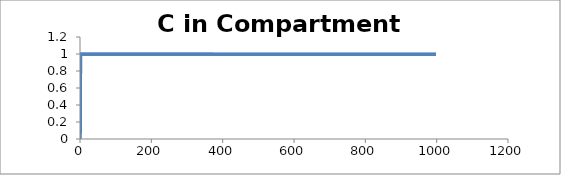
| Category | C - Sys 1 |
|---|---|
| 1.0 | 0 |
| 2.0 | 1 |
| 3.0 | 1 |
| 4.0 | 1 |
| 5.0 | 1 |
| 6.0 | 1 |
| 7.0 | 1 |
| 8.0 | 1 |
| 9.000000000000002 | 1 |
| 10.0 | 1 |
| 11.0 | 1 |
| 12.0 | 1 |
| 13.000000000000002 | 1 |
| 14.0 | 1 |
| 15.0 | 1 |
| 16.0 | 1 |
| 17.0 | 1 |
| 18.000000000000004 | 1 |
| 19.0 | 1 |
| 20.0 | 1 |
| 21.0 | 1 |
| 22.0 | 1 |
| 23.0 | 1 |
| 24.0 | 1 |
| 25.0 | 1 |
| 26.000000000000004 | 1 |
| 27.0 | 1 |
| 28.0 | 1 |
| 29.0 | 1 |
| 30.0 | 1 |
| 31.0 | 1 |
| 32.0 | 1 |
| 33.0 | 1 |
| 34.0 | 1 |
| 35.0 | 1 |
| 36.00000000000001 | 1 |
| 37.0 | 1 |
| 38.0 | 1 |
| 39.0 | 1 |
| 40.0 | 1 |
| 41.0 | 1 |
| 42.0 | 1 |
| 43.0 | 1 |
| 44.0 | 1 |
| 45.0 | 1 |
| 46.0 | 1 |
| 47.0 | 1 |
| 48.0 | 1 |
| 49.0 | 1 |
| 50.0 | 1 |
| 51.00000000000001 | 1 |
| 52.00000000000001 | 1 |
| 53.0 | 1 |
| 54.0 | 1 |
| 55.0 | 1 |
| 56.0 | 1 |
| 57.0 | 1 |
| 58.0 | 1 |
| 59.00000000000001 | 1 |
| 60.0 | 1 |
| 61.0 | 1 |
| 62.0 | 1 |
| 63.0 | 1 |
| 64.0 | 1 |
| 65.0 | 1 |
| 66.0 | 1 |
| 67.0 | 1 |
| 68.0 | 1 |
| 69.0 | 1 |
| 70.0 | 1 |
| 71.00000000000001 | 1 |
| 72.00000000000001 | 1 |
| 73.0 | 1 |
| 74.0 | 1 |
| 75.0 | 1 |
| 76.0 | 1 |
| 77.0 | 1 |
| 78.0 | 1 |
| 79.0 | 1 |
| 80.0 | 1 |
| 81.0 | 1 |
| 82.0 | 1 |
| 83.0 | 1 |
| 84.0 | 1 |
| 85.0 | 1 |
| 86.0 | 1 |
| 87.00000000000001 | 1 |
| 88.0 | 1 |
| 89.0 | 1 |
| 90.0 | 1 |
| 91.0 | 1 |
| 92.0 | 1 |
| 93.0 | 1 |
| 94.0 | 1 |
| 95.0 | 1 |
| 96.0 | 1 |
| 97.0 | 1 |
| 98.0 | 1 |
| 99.0 | 1 |
| 100.0 | 1 |
| 101.0 | 1 |
| 102.00000000000001 | 1 |
| 103.00000000000001 | 1 |
| 104.00000000000001 | 1 |
| 105.0 | 1 |
| 106.0 | 1 |
| 107.0 | 1 |
| 108.0 | 1 |
| 109.0 | 1 |
| 110.0 | 1 |
| 111.0 | 1 |
| 112.0 | 1 |
| 113.0 | 1 |
| 114.0 | 1 |
| 115.0 | 1 |
| 116.0 | 1 |
| 117.0 | 1 |
| 118.00000000000001 | 1 |
| 119.00000000000001 | 1 |
| 120.0 | 1 |
| 121.0 | 1 |
| 122.0 | 1 |
| 123.0 | 1 |
| 124.0 | 1 |
| 125.0 | 1 |
| 126.0 | 1 |
| 127.0 | 0.999 |
| 128.0 | 0.999 |
| 129.0 | 0.999 |
| 130.0 | 0.999 |
| 131.0 | 0.999 |
| 132.0 | 0.999 |
| 133.0 | 0.999 |
| 134.0 | 0.999 |
| 135.0 | 0.999 |
| 136.0 | 0.999 |
| 137.0 | 0.999 |
| 138.0 | 0.999 |
| 139.0 | 0.999 |
| 140.0 | 0.999 |
| 141.0 | 0.999 |
| 142.00000000000003 | 0.999 |
| 143.00000000000003 | 0.999 |
| 144.00000000000003 | 0.999 |
| 145.0 | 0.999 |
| 146.0 | 0.999 |
| 147.0 | 0.999 |
| 148.0 | 0.999 |
| 149.0 | 0.999 |
| 150.0 | 0.999 |
| 151.0 | 0.999 |
| 152.0 | 0.999 |
| 153.0 | 0.999 |
| 154.0 | 0.999 |
| 155.0 | 0.999 |
| 156.0 | 0.999 |
| 157.0 | 0.999 |
| 158.0 | 0.999 |
| 159.0 | 0.999 |
| 160.0 | 0.999 |
| 161.0 | 0.999 |
| 162.0 | 0.999 |
| 163.0 | 0.999 |
| 164.0 | 0.999 |
| 165.0 | 0.999 |
| 166.0 | 0.999 |
| 167.0 | 0.999 |
| 168.0 | 0.999 |
| 169.0 | 0.999 |
| 170.0 | 0.999 |
| 171.0 | 0.999 |
| 172.0 | 0.999 |
| 173.00000000000003 | 0.999 |
| 174.00000000000003 | 0.999 |
| 175.00000000000003 | 0.999 |
| 176.0 | 0.999 |
| 177.0 | 0.999 |
| 178.0 | 0.999 |
| 179.0 | 0.999 |
| 180.0 | 0.999 |
| 181.0 | 0.999 |
| 182.0 | 0.999 |
| 183.0 | 0.999 |
| 184.0 | 0.999 |
| 185.0 | 0.999 |
| 186.0 | 0.999 |
| 187.0 | 0.999 |
| 188.0 | 0.999 |
| 189.0 | 0.999 |
| 190.0 | 0.999 |
| 191.0 | 0.999 |
| 192.0 | 0.999 |
| 193.0 | 0.999 |
| 194.0 | 0.999 |
| 195.0 | 0.999 |
| 196.0 | 0.999 |
| 197.0 | 0.999 |
| 198.0 | 0.999 |
| 199.0 | 0.999 |
| 200.0 | 0.999 |
| 201.0 | 0.999 |
| 202.0 | 0.999 |
| 203.0 | 0.999 |
| 204.00000000000003 | 0.999 |
| 205.00000000000003 | 0.999 |
| 206.00000000000003 | 0.999 |
| 207.00000000000003 | 0.999 |
| 208.00000000000003 | 0.999 |
| 209.0 | 0.999 |
| 210.0 | 0.999 |
| 211.0 | 0.999 |
| 212.0 | 0.999 |
| 213.0 | 0.999 |
| 214.0 | 0.999 |
| 215.0 | 0.999 |
| 216.0 | 0.999 |
| 217.0 | 0.999 |
| 218.0 | 0.999 |
| 219.0 | 0.999 |
| 220.0 | 0.999 |
| 221.0 | 0.999 |
| 222.0 | 0.999 |
| 223.0 | 0.999 |
| 224.0 | 0.999 |
| 225.0 | 0.999 |
| 226.0 | 0.999 |
| 227.0 | 0.999 |
| 228.0 | 0.999 |
| 229.0 | 0.999 |
| 230.0 | 0.999 |
| 231.0 | 0.999 |
| 232.0 | 0.999 |
| 233.0 | 0.999 |
| 234.0 | 0.999 |
| 235.00000000000003 | 0.999 |
| 236.00000000000003 | 0.999 |
| 237.00000000000003 | 0.999 |
| 238.00000000000003 | 0.999 |
| 239.00000000000003 | 0.999 |
| 240.0 | 0.999 |
| 241.0 | 0.999 |
| 242.0 | 0.999 |
| 243.0 | 0.999 |
| 244.0 | 0.999 |
| 245.0 | 0.999 |
| 246.0 | 0.999 |
| 247.0 | 0.999 |
| 248.0 | 0.999 |
| 249.0 | 0.999 |
| 250.0 | 0.999 |
| 251.0 | 0.999 |
| 252.0 | 0.999 |
| 253.0 | 0.999 |
| 254.0 | 0.999 |
| 255.0 | 0.999 |
| 256.0 | 0.999 |
| 257.0 | 0.999 |
| 258.0 | 0.999 |
| 259.0 | 0.999 |
| 260.0 | 0.999 |
| 261.0 | 0.999 |
| 262.0 | 0.999 |
| 263.0 | 0.999 |
| 264.0 | 0.999 |
| 265.0 | 0.999 |
| 266.0 | 0.999 |
| 267.0 | 0.999 |
| 268.0 | 0.999 |
| 269.0 | 0.999 |
| 270.0 | 0.999 |
| 271.0 | 0.999 |
| 272.0 | 0.999 |
| 273.0 | 0.999 |
| 274.0 | 0.999 |
| 275.0 | 0.999 |
| 276.0 | 0.999 |
| 277.0 | 0.999 |
| 278.0 | 0.999 |
| 279.0 | 0.999 |
| 280.0 | 0.999 |
| 281.0 | 0.999 |
| 282.0 | 0.999 |
| 283.00000000000006 | 0.999 |
| 284.00000000000006 | 0.999 |
| 285.00000000000006 | 0.999 |
| 286.00000000000006 | 0.999 |
| 287.00000000000006 | 0.999 |
| 288.00000000000006 | 0.999 |
| 289.0 | 0.999 |
| 290.0 | 0.999 |
| 291.0 | 0.999 |
| 292.0 | 0.999 |
| 293.0 | 0.999 |
| 294.0 | 0.999 |
| 295.0 | 0.999 |
| 296.0 | 0.999 |
| 297.0 | 0.999 |
| 298.0 | 0.999 |
| 299.0 | 0.999 |
| 300.0 | 0.999 |
| 301.0 | 0.999 |
| 302.0 | 0.999 |
| 303.0 | 0.999 |
| 304.0 | 0.999 |
| 305.0 | 0.999 |
| 306.0 | 0.999 |
| 307.0 | 0.999 |
| 308.0 | 0.999 |
| 309.0 | 0.999 |
| 310.0 | 0.999 |
| 311.0 | 0.999 |
| 312.0 | 0.999 |
| 313.0 | 0.999 |
| 314.0 | 0.999 |
| 315.0 | 0.999 |
| 316.0 | 0.999 |
| 317.0 | 0.999 |
| 318.0 | 0.999 |
| 319.0 | 0.999 |
| 320.0 | 0.999 |
| 321.0 | 0.999 |
| 322.0 | 0.999 |
| 323.0 | 0.999 |
| 324.0 | 0.999 |
| 325.0 | 0.999 |
| 326.0 | 0.999 |
| 327.0 | 0.999 |
| 328.0 | 0.999 |
| 329.0 | 0.999 |
| 330.0 | 0.999 |
| 331.0 | 0.999 |
| 332.0 | 0.999 |
| 333.0 | 0.999 |
| 334.0 | 0.999 |
| 335.0 | 0.999 |
| 336.0 | 0.999 |
| 337.0 | 0.999 |
| 338.0 | 0.999 |
| 339.0 | 0.999 |
| 340.0 | 0.999 |
| 341.0 | 0.999 |
| 342.0 | 0.999 |
| 343.0 | 0.999 |
| 344.0 | 0.999 |
| 345.00000000000006 | 0.999 |
| 346.00000000000006 | 0.999 |
| 347.00000000000006 | 0.999 |
| 348.00000000000006 | 0.999 |
| 349.00000000000006 | 0.999 |
| 350.00000000000006 | 0.999 |
| 351.00000000000006 | 0.999 |
| 352.0 | 0.999 |
| 353.0 | 0.999 |
| 354.0 | 0.999 |
| 355.0 | 0.999 |
| 356.0 | 0.999 |
| 357.0 | 0.999 |
| 358.0 | 0.999 |
| 359.0 | 0.999 |
| 360.0 | 0.999 |
| 361.0 | 0.999 |
| 362.0 | 0.999 |
| 363.0 | 0.999 |
| 364.0 | 0.999 |
| 365.0 | 0.999 |
| 366.0 | 0.999 |
| 367.0 | 0.999 |
| 368.0 | 0.999 |
| 369.0 | 0.999 |
| 370.0 | 0.999 |
| 371.0 | 0.999 |
| 372.0 | 0.999 |
| 373.0 | 0.999 |
| 374.0 | 0.999 |
| 375.0 | 0.999 |
| 376.0 | 0.999 |
| 377.0 | 0.999 |
| 378.0 | 0.999 |
| 379.0 | 0.999 |
| 380.0 | 0.998 |
| 381.0 | 0.998 |
| 382.0 | 0.998 |
| 383.0 | 0.998 |
| 384.0 | 0.998 |
| 385.0 | 0.998 |
| 386.0 | 0.998 |
| 387.0 | 0.998 |
| 388.0 | 0.998 |
| 389.0 | 0.998 |
| 390.0 | 0.998 |
| 391.0 | 0.998 |
| 392.0 | 0.998 |
| 393.0 | 0.998 |
| 394.0 | 0.998 |
| 395.0 | 0.998 |
| 396.0 | 0.998 |
| 397.0 | 0.998 |
| 398.0 | 0.998 |
| 399.0 | 0.998 |
| 400.0 | 0.998 |
| 401.0 | 0.998 |
| 402.0 | 0.998 |
| 403.0 | 0.998 |
| 404.0 | 0.998 |
| 405.0 | 0.998 |
| 406.0 | 0.998 |
| 407.0 | 0.998 |
| 408.00000000000006 | 0.998 |
| 409.00000000000006 | 0.998 |
| 410.00000000000006 | 0.998 |
| 411.00000000000006 | 0.998 |
| 412.00000000000006 | 0.998 |
| 413.00000000000006 | 0.998 |
| 414.00000000000006 | 0.998 |
| 415.00000000000006 | 0.998 |
| 416.00000000000006 | 0.998 |
| 417.0 | 0.998 |
| 418.0 | 0.998 |
| 419.0 | 0.998 |
| 420.0 | 0.998 |
| 421.0 | 0.998 |
| 422.0 | 0.998 |
| 423.0 | 0.998 |
| 424.0 | 0.998 |
| 425.0 | 0.998 |
| 426.0 | 0.998 |
| 427.0 | 0.998 |
| 428.0 | 0.998 |
| 429.0 | 0.998 |
| 430.0 | 0.998 |
| 431.0 | 0.998 |
| 432.0 | 0.998 |
| 433.0 | 0.998 |
| 434.0 | 0.998 |
| 435.0 | 0.998 |
| 436.0 | 0.998 |
| 437.0 | 0.998 |
| 438.0 | 0.998 |
| 439.0 | 0.998 |
| 440.0 | 0.998 |
| 441.0 | 0.998 |
| 442.0 | 0.998 |
| 443.0 | 0.998 |
| 444.0 | 0.998 |
| 445.0 | 0.998 |
| 446.0 | 0.998 |
| 447.0 | 0.998 |
| 448.0 | 0.998 |
| 449.0 | 0.998 |
| 450.0 | 0.998 |
| 451.0 | 0.998 |
| 452.0 | 0.998 |
| 453.0 | 0.998 |
| 454.0 | 0.998 |
| 455.0 | 0.998 |
| 456.0 | 0.998 |
| 457.0 | 0.998 |
| 458.0 | 0.998 |
| 459.0 | 0.998 |
| 460.0 | 0.998 |
| 461.0 | 0.998 |
| 462.0 | 0.998 |
| 463.0 | 0.998 |
| 464.0 | 0.998 |
| 465.0 | 0.998 |
| 466.0 | 0.998 |
| 467.0 | 0.998 |
| 468.0 | 0.998 |
| 469.0 | 0.998 |
| 470.00000000000006 | 0.998 |
| 471.00000000000006 | 0.998 |
| 472.00000000000006 | 0.998 |
| 473.00000000000006 | 0.998 |
| 474.00000000000006 | 0.998 |
| 475.00000000000006 | 0.998 |
| 476.00000000000006 | 0.998 |
| 477.00000000000006 | 0.998 |
| 478.00000000000006 | 0.998 |
| 479.00000000000006 | 0.998 |
| 480.0 | 0.998 |
| 481.0 | 0.998 |
| 482.0 | 0.998 |
| 483.0 | 0.998 |
| 484.0 | 0.998 |
| 485.0 | 0.998 |
| 486.0 | 0.998 |
| 487.0 | 0.998 |
| 488.0 | 0.998 |
| 489.0 | 0.998 |
| 490.0 | 0.998 |
| 491.0 | 0.998 |
| 492.0 | 0.998 |
| 493.0 | 0.998 |
| 494.0 | 0.998 |
| 495.0 | 0.998 |
| 496.0 | 0.998 |
| 497.0 | 0.998 |
| 498.0 | 0.998 |
| 499.0 | 0.998 |
| 500.0 | 0.998 |
| 501.0 | 0.998 |
| 502.0 | 0.998 |
| 503.0 | 0.998 |
| 504.0 | 0.998 |
| 505.0 | 0.998 |
| 506.0 | 0.998 |
| 507.0 | 0.998 |
| 508.0 | 0.998 |
| 509.0 | 0.998 |
| 510.0 | 0.998 |
| 511.0 | 0.998 |
| 512.0 | 0.998 |
| 513.0 | 0.998 |
| 514.0 | 0.998 |
| 515.0 | 0.998 |
| 516.0 | 0.998 |
| 517.0 | 0.998 |
| 518.0 | 0.998 |
| 519.0 | 0.998 |
| 520.0 | 0.998 |
| 521.0 | 0.998 |
| 522.0 | 0.998 |
| 523.0 | 0.998 |
| 524.0 | 0.998 |
| 525.0 | 0.998 |
| 526.0 | 0.998 |
| 527.0 | 0.998 |
| 528.0 | 0.998 |
| 529.0 | 0.998 |
| 530.0 | 0.998 |
| 531.0 | 0.998 |
| 532.0 | 0.998 |
| 533.0 | 0.998 |
| 534.0 | 0.998 |
| 535.0 | 0.998 |
| 536.0 | 0.998 |
| 537.0 | 0.998 |
| 538.0 | 0.998 |
| 539.0 | 0.998 |
| 540.0 | 0.998 |
| 541.0 | 0.998 |
| 542.0 | 0.998 |
| 543.0 | 0.998 |
| 544.0 | 0.998 |
| 545.0 | 0.998 |
| 546.0 | 0.998 |
| 547.0 | 0.998 |
| 548.0 | 0.998 |
| 549.0 | 0.998 |
| 550.0 | 0.998 |
| 551.0 | 0.998 |
| 552.0 | 0.998 |
| 553.0 | 0.998 |
| 554.0 | 0.998 |
| 555.0 | 0.998 |
| 556.0 | 0.998 |
| 557.0 | 0.998 |
| 558.0 | 0.998 |
| 559.0 | 0.998 |
| 560.0 | 0.998 |
| 561.0 | 0.998 |
| 562.0 | 0.998 |
| 563.0 | 0.998 |
| 564.0 | 0.998 |
| 565.0000000000001 | 0.998 |
| 566.0000000000001 | 0.998 |
| 567.0000000000001 | 0.998 |
| 568.0000000000001 | 0.998 |
| 569.0000000000001 | 0.998 |
| 570.0000000000001 | 0.998 |
| 571.0000000000001 | 0.998 |
| 572.0000000000001 | 0.998 |
| 573.0000000000001 | 0.998 |
| 574.0000000000001 | 0.998 |
| 575.0000000000001 | 0.998 |
| 576.0000000000001 | 0.998 |
| 577.0 | 0.998 |
| 578.0 | 0.998 |
| 579.0 | 0.998 |
| 580.0 | 0.998 |
| 581.0 | 0.998 |
| 582.0 | 0.998 |
| 583.0 | 0.998 |
| 584.0 | 0.998 |
| 585.0 | 0.998 |
| 586.0 | 0.998 |
| 587.0 | 0.998 |
| 588.0 | 0.998 |
| 589.0 | 0.998 |
| 590.0 | 0.998 |
| 591.0 | 0.998 |
| 592.0 | 0.998 |
| 593.0 | 0.998 |
| 594.0 | 0.998 |
| 595.0 | 0.998 |
| 596.0 | 0.998 |
| 597.0 | 0.998 |
| 598.0 | 0.998 |
| 599.0 | 0.998 |
| 600.0 | 0.998 |
| 601.0 | 0.998 |
| 602.0 | 0.998 |
| 603.0 | 0.998 |
| 604.0 | 0.998 |
| 605.0 | 0.998 |
| 606.0 | 0.998 |
| 607.0 | 0.998 |
| 608.0 | 0.998 |
| 609.0 | 0.998 |
| 610.0 | 0.998 |
| 611.0 | 0.998 |
| 612.0 | 0.998 |
| 613.0 | 0.998 |
| 614.0 | 0.998 |
| 615.0 | 0.998 |
| 616.0 | 0.998 |
| 617.0 | 0.998 |
| 618.0 | 0.998 |
| 619.0 | 0.998 |
| 620.0 | 0.998 |
| 621.0 | 0.998 |
| 622.0 | 0.998 |
| 623.0 | 0.998 |
| 624.0 | 0.998 |
| 625.0 | 0.998 |
| 626.0 | 0.998 |
| 627.0 | 0.998 |
| 628.0 | 0.998 |
| 629.0 | 0.998 |
| 630.0 | 0.998 |
| 631.0 | 0.998 |
| 632.0 | 0.998 |
| 633.0 | 0.998 |
| 634.0 | 0.998 |
| 635.0 | 0.997 |
| 636.0 | 0.997 |
| 637.0 | 0.997 |
| 638.0 | 0.997 |
| 639.0 | 0.997 |
| 640.0 | 0.997 |
| 641.0 | 0.997 |
| 642.0 | 0.997 |
| 643.0 | 0.997 |
| 644.0 | 0.997 |
| 645.0 | 0.997 |
| 646.0 | 0.997 |
| 647.0 | 0.997 |
| 648.0 | 0.997 |
| 649.0 | 0.997 |
| 650.0 | 0.997 |
| 651.0 | 0.997 |
| 652.0 | 0.997 |
| 653.0 | 0.997 |
| 654.0 | 0.997 |
| 655.0 | 0.997 |
| 656.0 | 0.997 |
| 657.0 | 0.997 |
| 658.0 | 0.997 |
| 659.0 | 0.997 |
| 660.0 | 0.997 |
| 661.0 | 0.997 |
| 662.0 | 0.997 |
| 663.0 | 0.997 |
| 664.0 | 0.997 |
| 665.0 | 0.997 |
| 666.0 | 0.997 |
| 667.0 | 0.997 |
| 668.0 | 0.997 |
| 669.0 | 0.997 |
| 670.0 | 0.997 |
| 671.0 | 0.997 |
| 672.0 | 0.997 |
| 673.0 | 0.997 |
| 674.0 | 0.997 |
| 675.0 | 0.997 |
| 676.0 | 0.997 |
| 677.0 | 0.997 |
| 678.0 | 0.997 |
| 679.0 | 0.997 |
| 680.0 | 0.997 |
| 681.0 | 0.997 |
| 682.0 | 0.997 |
| 683.0 | 0.997 |
| 684.0 | 0.997 |
| 685.0 | 0.997 |
| 686.0 | 0.997 |
| 687.0 | 0.997 |
| 688.0 | 0.997 |
| 689.0 | 0.997 |
| 690.0000000000001 | 0.997 |
| 691.0000000000001 | 0.997 |
| 692.0000000000001 | 0.997 |
| 693.0000000000001 | 0.997 |
| 694.0000000000001 | 0.997 |
| 695.0000000000001 | 0.997 |
| 696.0000000000001 | 0.997 |
| 697.0000000000001 | 0.997 |
| 698.0000000000001 | 0.997 |
| 699.0000000000001 | 0.997 |
| 700.0000000000001 | 0.997 |
| 701.0000000000001 | 0.997 |
| 702.0000000000001 | 0.997 |
| 703.0000000000001 | 0.997 |
| 704.0 | 0.997 |
| 705.0 | 0.997 |
| 706.0 | 0.997 |
| 707.0 | 0.997 |
| 708.0 | 0.997 |
| 709.0 | 0.997 |
| 710.0 | 0.997 |
| 711.0 | 0.997 |
| 712.0 | 0.997 |
| 713.0 | 0.997 |
| 714.0 | 0.997 |
| 715.0 | 0.997 |
| 716.0 | 0.997 |
| 717.0 | 0.997 |
| 718.0 | 0.997 |
| 719.0 | 0.997 |
| 720.0 | 0.997 |
| 721.0 | 0.997 |
| 722.0 | 0.997 |
| 723.0 | 0.997 |
| 724.0 | 0.997 |
| 725.0 | 0.997 |
| 726.0 | 0.997 |
| 727.0 | 0.997 |
| 728.0 | 0.997 |
| 729.0 | 0.997 |
| 730.0 | 0.997 |
| 731.0 | 0.997 |
| 732.0 | 0.997 |
| 733.0 | 0.997 |
| 734.0 | 0.997 |
| 735.0 | 0.997 |
| 736.0 | 0.997 |
| 737.0 | 0.997 |
| 738.0 | 0.997 |
| 739.0 | 0.997 |
| 740.0 | 0.997 |
| 741.0 | 0.997 |
| 742.0 | 0.997 |
| 743.0 | 0.997 |
| 744.0 | 0.997 |
| 745.0 | 0.997 |
| 746.0 | 0.997 |
| 747.0 | 0.997 |
| 748.0 | 0.997 |
| 749.0 | 0.997 |
| 750.0 | 0.997 |
| 751.0 | 0.997 |
| 752.0 | 0.997 |
| 753.0 | 0.997 |
| 754.0 | 0.997 |
| 755.0 | 0.997 |
| 756.0 | 0.997 |
| 757.0 | 0.997 |
| 758.0 | 0.997 |
| 759.0 | 0.997 |
| 760.0 | 0.997 |
| 761.0 | 0.997 |
| 762.0 | 0.997 |
| 763.0 | 0.997 |
| 764.0 | 0.997 |
| 765.0 | 0.997 |
| 766.0 | 0.997 |
| 767.0 | 0.997 |
| 768.0 | 0.997 |
| 769.0 | 0.997 |
| 770.0 | 0.997 |
| 771.0 | 0.997 |
| 772.0 | 0.997 |
| 773.0 | 0.997 |
| 774.0 | 0.997 |
| 775.0 | 0.997 |
| 776.0 | 0.997 |
| 777.0 | 0.997 |
| 778.0 | 0.997 |
| 779.0 | 0.997 |
| 780.0 | 0.997 |
| 781.0 | 0.997 |
| 782.0 | 0.997 |
| 783.0 | 0.997 |
| 784.0 | 0.997 |
| 785.0 | 0.997 |
| 786.0 | 0.997 |
| 787.0 | 0.997 |
| 788.0 | 0.997 |
| 789.0 | 0.997 |
| 790.0 | 0.997 |
| 791.0 | 0.997 |
| 792.0 | 0.997 |
| 793.0 | 0.997 |
| 794.0 | 0.997 |
| 795.0 | 0.997 |
| 796.0 | 0.997 |
| 797.0 | 0.997 |
| 798.0 | 0.997 |
| 799.0 | 0.997 |
| 800.0 | 0.997 |
| 801.0 | 0.997 |
| 802.0 | 0.997 |
| 803.0 | 0.997 |
| 804.0 | 0.997 |
| 805.0 | 0.997 |
| 806.0 | 0.997 |
| 807.0 | 0.997 |
| 808.0 | 0.997 |
| 809.0 | 0.997 |
| 810.0 | 0.997 |
| 811.0 | 0.997 |
| 812.0 | 0.997 |
| 813.0 | 0.997 |
| 814.0 | 0.997 |
| 815.0000000000001 | 0.997 |
| 816.0000000000001 | 0.997 |
| 817.0000000000001 | 0.997 |
| 818.0000000000001 | 0.997 |
| 819.0000000000001 | 0.997 |
| 820.0000000000001 | 0.997 |
| 821.0000000000001 | 0.997 |
| 822.0000000000001 | 0.997 |
| 823.0000000000001 | 0.997 |
| 824.0000000000001 | 0.997 |
| 825.0000000000001 | 0.997 |
| 826.0000000000001 | 0.997 |
| 827.0000000000001 | 0.997 |
| 828.0000000000001 | 0.997 |
| 829.0000000000001 | 0.997 |
| 830.0000000000001 | 0.997 |
| 831.0000000000001 | 0.997 |
| 832.0000000000001 | 0.997 |
| 833.0 | 0.997 |
| 834.0 | 0.997 |
| 835.0 | 0.997 |
| 836.0 | 0.997 |
| 837.0 | 0.997 |
| 838.0 | 0.997 |
| 839.0 | 0.997 |
| 840.0 | 0.997 |
| 841.0 | 0.997 |
| 842.0 | 0.997 |
| 843.0 | 0.997 |
| 844.0 | 0.997 |
| 845.0 | 0.997 |
| 846.0 | 0.997 |
| 847.0 | 0.997 |
| 848.0 | 0.997 |
| 849.0 | 0.997 |
| 850.0 | 0.997 |
| 851.0 | 0.997 |
| 852.0 | 0.997 |
| 853.0 | 0.997 |
| 854.0 | 0.997 |
| 855.0 | 0.997 |
| 856.0 | 0.997 |
| 857.0 | 0.997 |
| 858.0 | 0.997 |
| 859.0 | 0.997 |
| 860.0 | 0.997 |
| 861.0 | 0.997 |
| 862.0 | 0.997 |
| 863.0 | 0.997 |
| 864.0 | 0.997 |
| 865.0 | 0.997 |
| 866.0 | 0.997 |
| 867.0 | 0.997 |
| 868.0 | 0.997 |
| 869.0 | 0.997 |
| 870.0 | 0.997 |
| 871.0 | 0.997 |
| 872.0 | 0.997 |
| 873.0 | 0.997 |
| 874.0 | 0.997 |
| 875.0 | 0.997 |
| 876.0 | 0.997 |
| 877.0 | 0.997 |
| 878.0 | 0.997 |
| 879.0 | 0.997 |
| 880.0 | 0.997 |
| 881.0 | 0.997 |
| 882.0 | 0.997 |
| 883.0 | 0.997 |
| 884.0 | 0.997 |
| 885.0 | 0.997 |
| 886.0 | 0.997 |
| 887.0 | 0.997 |
| 888.0 | 0.997 |
| 889.0 | 0.997 |
| 890.0 | 0.997 |
| 891.0 | 0.997 |
| 892.0 | 0.997 |
| 893.0 | 0.997 |
| 894.0 | 0.996 |
| 895.0 | 0.996 |
| 896.0 | 0.996 |
| 897.0 | 0.996 |
| 898.0 | 0.996 |
| 899.0 | 0.996 |
| 900.0 | 0.996 |
| 901.0 | 0.996 |
| 902.0 | 0.996 |
| 903.0 | 0.996 |
| 904.0 | 0.996 |
| 905.0 | 0.996 |
| 906.0 | 0.996 |
| 907.0 | 0.996 |
| 908.0 | 0.996 |
| 909.0 | 0.996 |
| 910.0 | 0.996 |
| 911.0 | 0.996 |
| 912.0 | 0.996 |
| 913.0 | 0.996 |
| 914.0 | 0.996 |
| 915.0 | 0.996 |
| 916.0 | 0.996 |
| 917.0 | 0.996 |
| 918.0 | 0.996 |
| 919.0 | 0.996 |
| 920.0 | 0.996 |
| 921.0 | 0.996 |
| 922.0 | 0.996 |
| 923.0 | 0.996 |
| 924.0 | 0.996 |
| 925.0 | 0.996 |
| 926.0 | 0.996 |
| 927.0 | 0.996 |
| 928.0 | 0.996 |
| 929.0 | 0.996 |
| 930.0 | 0.996 |
| 931.0 | 0.996 |
| 932.0 | 0.996 |
| 933.0 | 0.996 |
| 934.0 | 0.996 |
| 935.0 | 0.996 |
| 936.0 | 0.996 |
| 937.0 | 0.996 |
| 938.0 | 0.996 |
| 939.0 | 0.996 |
| 940.0000000000001 | 0.996 |
| 941.0000000000001 | 0.996 |
| 942.0000000000001 | 0.996 |
| 943.0000000000001 | 0.996 |
| 944.0000000000001 | 0.996 |
| 945.0000000000001 | 0.996 |
| 946.0000000000001 | 0.996 |
| 947.0000000000001 | 0.996 |
| 948.0000000000001 | 0.996 |
| 949.0000000000001 | 0.996 |
| 950.0000000000001 | 0.996 |
| 951.0000000000001 | 0.996 |
| 952.0000000000001 | 0.996 |
| 953.0000000000001 | 0.996 |
| 954.0000000000001 | 0.996 |
| 955.0000000000001 | 0.996 |
| 956.0000000000001 | 0.996 |
| 957.0000000000001 | 0.996 |
| 958.0000000000001 | 0.996 |
| 959.0000000000001 | 0.996 |
| 960.0 | 0.996 |
| 961.0 | 0.996 |
| 962.0 | 0.996 |
| 963.0 | 0.996 |
| 964.0 | 0.996 |
| 965.0 | 0.996 |
| 966.0 | 0.996 |
| 967.0 | 0.996 |
| 968.0 | 0.996 |
| 969.0 | 0.996 |
| 970.0 | 0.996 |
| 971.0 | 0.996 |
| 972.0 | 0.996 |
| 973.0 | 0.996 |
| 974.0 | 0.996 |
| 975.0 | 0.996 |
| 976.0 | 0.996 |
| 977.0 | 0.996 |
| 978.0 | 0.996 |
| 979.0 | 0.996 |
| 980.0 | 0.996 |
| 981.0 | 0.996 |
| 982.0 | 0.996 |
| 983.0 | 0.996 |
| 984.0 | 0.996 |
| 985.0 | 0.996 |
| 986.0 | 0.996 |
| 987.0 | 0.996 |
| 988.0 | 0.996 |
| 989.0 | 0.996 |
| 990.0 | 0.996 |
| 991.0 | 0.996 |
| 992.0 | 0.996 |
| 993.0 | 0.996 |
| 994.0 | 0.996 |
| 995.0 | 0.996 |
| 996.0 | 0.996 |
| 997.0 | 0.996 |
| 998.0 | 0.996 |
| 999.0 | 0.996 |
| 1000.0 | 0.996 |